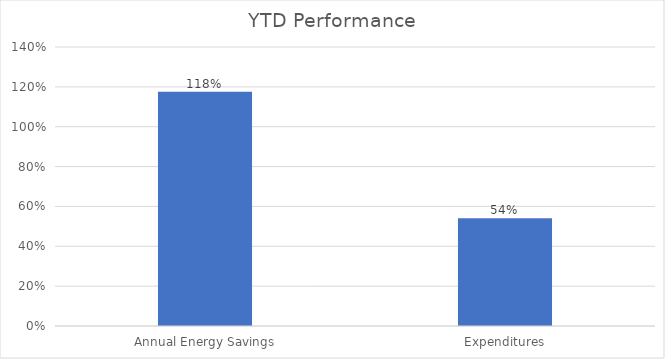
| Category | Series 0 |
|---|---|
| Annual Energy Savings | 1.176 |
| Expenditures | 0.54 |